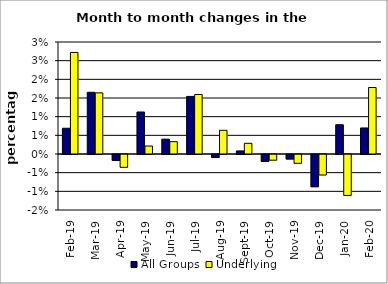
| Category | All Groups | Underlying |
|---|---|---|
| 2019-02-01 | 0.007 | 0.027 |
| 2019-03-01 | 0.017 | 0.016 |
| 2019-04-01 | -0.002 | -0.003 |
| 2019-05-01 | 0.011 | 0.002 |
| 2019-06-01 | 0.004 | 0.003 |
| 2019-07-01 | 0.015 | 0.016 |
| 2019-08-01 | -0.001 | 0.006 |
| 2019-09-01 | 0.001 | 0.003 |
| 2019-10-01 | -0.002 | -0.002 |
| 2019-11-01 | -0.001 | -0.002 |
| 2019-12-01 | -0.009 | -0.005 |
| 2020-01-01 | 0.008 | -0.011 |
| 2020-02-01 | 0.007 | 0.018 |